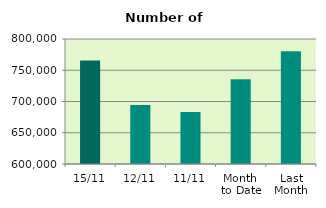
| Category | Series 0 |
|---|---|
| 15/11 | 765616 |
| 12/11 | 694386 |
| 11/11 | 683072 |
| Month 
to Date | 735413.091 |
| Last
Month | 780428.952 |